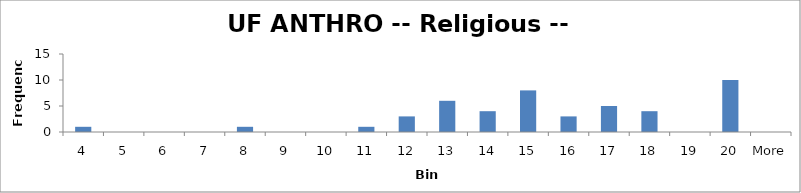
| Category | Frequency |
|---|---|
| 4 | 1 |
| 5 | 0 |
| 6 | 0 |
| 7 | 0 |
| 8 | 1 |
| 9 | 0 |
| 10 | 0 |
| 11 | 1 |
| 12 | 3 |
| 13 | 6 |
| 14 | 4 |
| 15 | 8 |
| 16 | 3 |
| 17 | 5 |
| 18 | 4 |
| 19 | 0 |
| 20 | 10 |
| More | 0 |